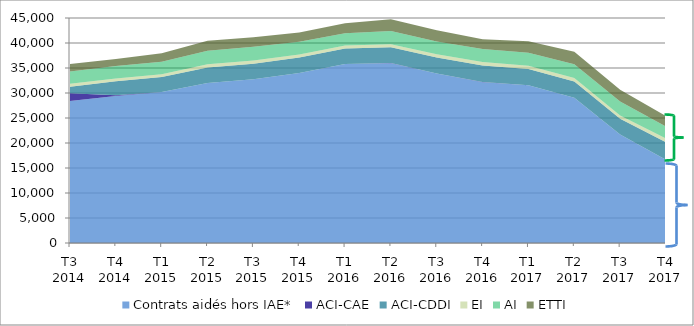
| Category | Contrats aidés hors IAE* | ACI-CAE | ACI-CDDI | EI | AI | ETTI |
|---|---|---|---|---|---|---|
| T3 2014 | 28385 | 1566 | 1303 | 574 | 2491 | 1484 |
| T4 2014 | 29376 | 197 | 2759 | 586 | 2486 | 1386 |
| T1 2015 | 30185 | 2 | 3022 | 559 | 2496 | 1675 |
| T2 2015 | 32006 | 2 | 3117 | 631 | 2691 | 1984 |
| T3 2015 | 32750 | 2 | 3112 | 626 | 2749 | 1901 |
| T4 2015 | 33983 | 1 | 3101 | 600 | 2588 | 1841 |
| T1 2016 | 35812 | 2 | 3090 | 601 | 2463 | 1960 |
| T2 2016 | 35975 | 3 | 3149 | 621 | 2659 | 2350 |
| T3 2016 | 33891 | 2 | 3206 | 642 | 2546 | 2282 |
| T4 2016 | 32175 | 2 | 3345 | 662 | 2596 | 1993 |
| T1 2017 | 31534 | 1 | 3265 | 668 | 2589 | 2302 |
| T2 2017 | 29062 | 1 | 3251 | 687 | 2734 | 2536 |
| T3 2017 | 21684 | 0 | 3171 | 656 | 2797 | 2325 |
| T4 2017 | 16642 | 0 | 3485 | 769 | 2391 | 2080 |